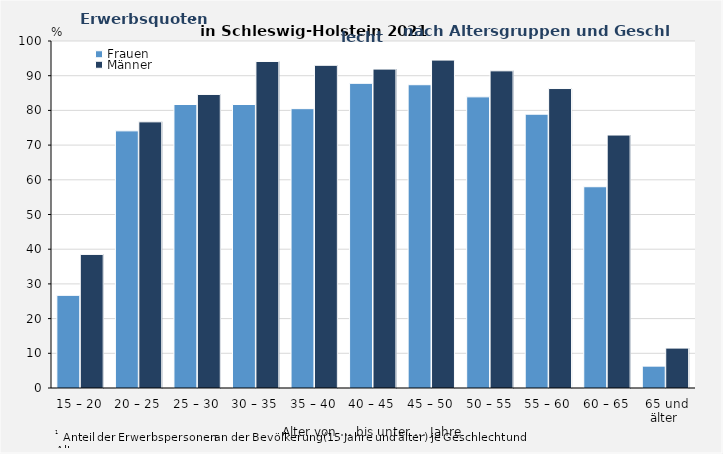
| Category | Frauen | Männer |
|---|---|---|
| 15 – 20 | 26.7 | 38.5 |
| 20 – 25 | 74.1 | 76.7 |
| 25 – 30 | 81.7 | 84.6 |
| 30 – 35 | 81.7 | 94.1 |
| 35 – 40 | 80.5 | 93 |
| 40 – 45 | 87.8 | 91.9 |
| 45 – 50 | 87.4 | 94.5 |
| 50 – 55 | 83.9 | 91.4 |
| 55 – 60 | 78.9 | 86.3 |
| 60 – 65 | 58 | 72.9 |
| 65 und älter  | 6.3 | 11.5 |